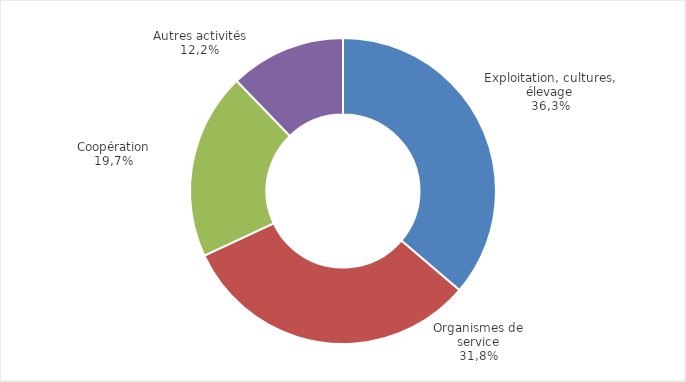
| Category | Series 0 |
|---|---|
| Exploitation, cultures, élevage (production agricole) | 9017.749 |
| Organismes de services (Tertiaire) | 7925.148 |
| Coopération (Transformation) | 4911.19 |
| Autres activités | 3041.442 |